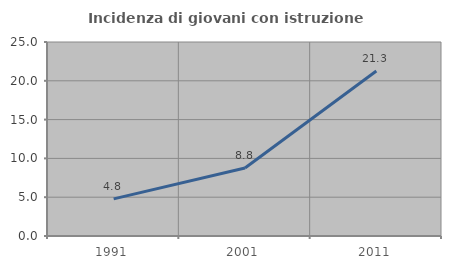
| Category | Incidenza di giovani con istruzione universitaria |
|---|---|
| 1991.0 | 4.782 |
| 2001.0 | 8.773 |
| 2011.0 | 21.256 |